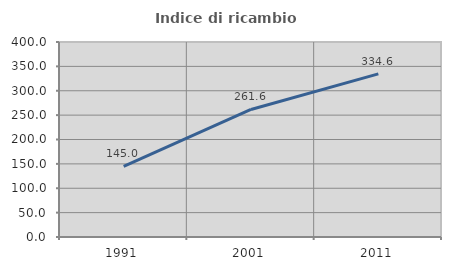
| Category | Indice di ricambio occupazionale  |
|---|---|
| 1991.0 | 145 |
| 2001.0 | 261.573 |
| 2011.0 | 334.608 |